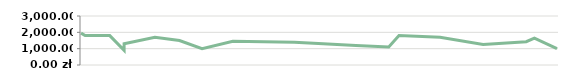
| Category | PRZYCHÓD |
|---|---|
| 2013-04-23 | 1950 |
| 2013-04-25 | 1800 |
| 2013-05-07 | 1800 |
| 2013-05-14 | 900 |
| 2013-05-14 | 1300 |
| 2013-05-29 | 1700 |
| 2013-06-10 | 1500 |
| 2013-06-21 | 1000 |
| 2013-07-06 | 1450 |
| 2013-08-05 | 1400 |
| 2013-08-19 | 1300 |
| 2013-09-04 | 1200 |
| 2013-09-20 | 1100 |
| 2013-09-25 | 1800 |
| 2013-10-15 | 1700 |
| 2013-11-05 | 1250 |
| 2013-11-26 | 1425 |
| 2013-11-30 | 1650 |
| 2013-12-11 | 1000 |